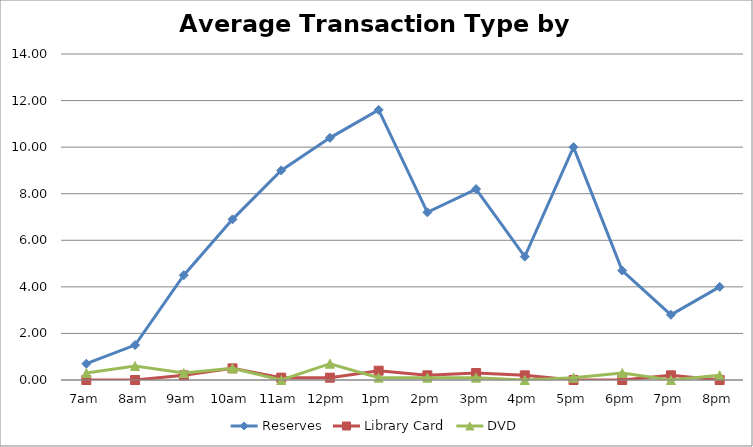
| Category | Reserves | Library Card | DVD |
|---|---|---|---|
| 7am | 0.7 | 0 | 0.3 |
| 8am | 1.5 | 0 | 0.6 |
| 9am | 4.5 | 0.2 | 0.3 |
| 10am | 6.9 | 0.5 | 0.5 |
| 11am | 9 | 0.1 | 0 |
| 12pm | 10.4 | 0.1 | 0.7 |
| 1pm | 11.6 | 0.4 | 0.1 |
| 2pm | 7.2 | 0.2 | 0.1 |
| 3pm | 8.2 | 0.3 | 0.1 |
| 4pm | 5.3 | 0.2 | 0 |
| 5pm | 10 | 0 | 0.1 |
| 6pm | 4.7 | 0 | 0.3 |
| 7pm | 2.8 | 0.2 | 0 |
| 8pm | 4 | 0 | 0.2 |